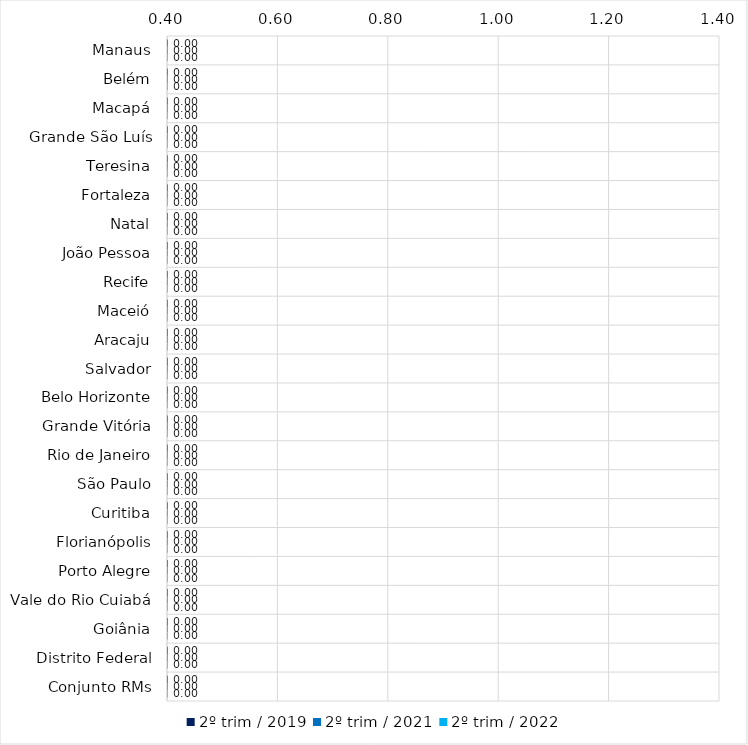
| Category | 2º trim / 2019 | 2º trim / 2021 | 2º trim / 2022 |
|---|---|---|---|
| Manaus | 0 | 0 | 0 |
| Belém | 0 | 0 | 0 |
| Macapá | 0 | 0 | 0 |
| Grande São Luís | 0 | 0 | 0 |
| Teresina | 0 | 0 | 0 |
| Fortaleza | 0 | 0 | 0 |
| Natal | 0 | 0 | 0 |
| João Pessoa | 0 | 0 | 0 |
| Recife | 0 | 0 | 0 |
| Maceió | 0 | 0 | 0 |
| Aracaju | 0 | 0 | 0 |
| Salvador | 0 | 0 | 0 |
| Belo Horizonte | 0 | 0 | 0 |
| Grande Vitória | 0 | 0 | 0 |
| Rio de Janeiro | 0 | 0 | 0 |
| São Paulo | 0 | 0 | 0 |
| Curitiba | 0 | 0 | 0 |
| Florianópolis | 0 | 0 | 0 |
| Porto Alegre | 0 | 0 | 0 |
| Vale do Rio Cuiabá | 0 | 0 | 0 |
| Goiânia | 0 | 0 | 0 |
| Distrito Federal | 0 | 0 | 0 |
| Conjunto RMs | 0 | 0 | 0 |